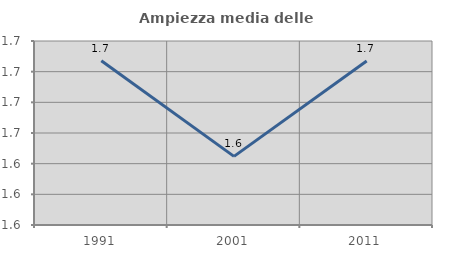
| Category | Ampiezza media delle famiglie |
|---|---|
| 1991.0 | 1.707 |
| 2001.0 | 1.645 |
| 2011.0 | 1.707 |